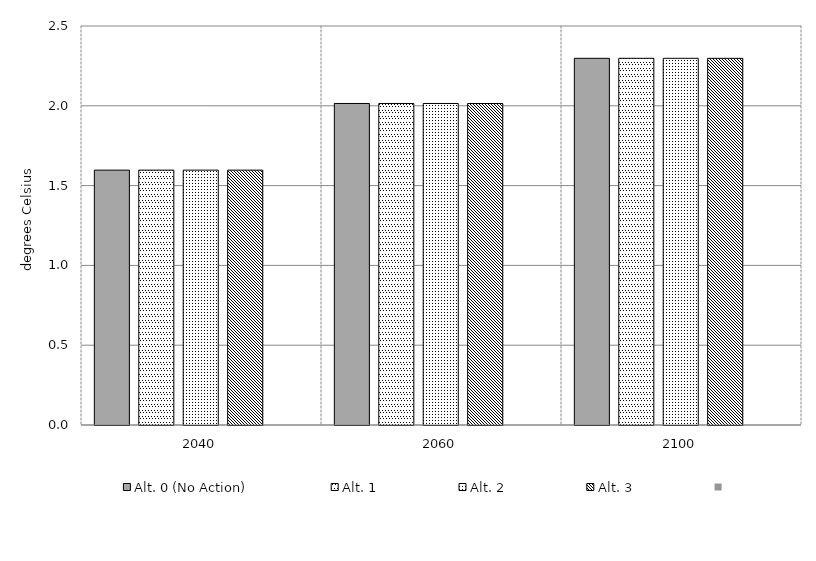
| Category | Alt. 0 (No Action) | Alt. 1 | Alt. 2 | Alt. 3 | Series 4 | Alt 5 | Alt 6 | Alt 7 | Alt 8 | Alt 10 |
|---|---|---|---|---|---|---|---|---|---|---|
| 2040.0 | 1.597 | 1.597 | 1.597 | 1.597 |  |  |  |  |  |  |
| 2060.0 | 2.015 | 2.015 | 2.015 | 2.015 |  |  |  |  |  |  |
| 2100.0 | 2.298 | 2.298 | 2.298 | 2.297 |  |  |  |  |  |  |